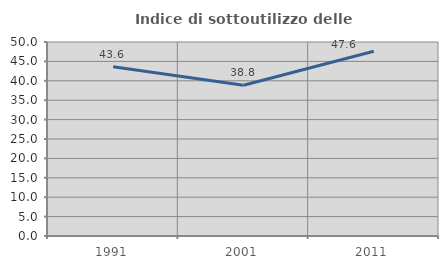
| Category | Indice di sottoutilizzo delle abitazioni  |
|---|---|
| 1991.0 | 43.636 |
| 2001.0 | 38.835 |
| 2011.0 | 47.619 |